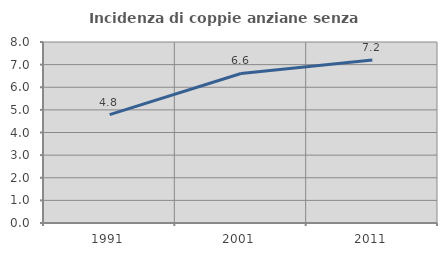
| Category | Incidenza di coppie anziane senza figli  |
|---|---|
| 1991.0 | 4.789 |
| 2001.0 | 6.609 |
| 2011.0 | 7.209 |